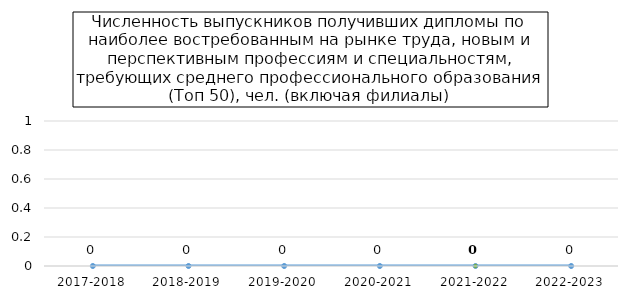
| Category | Series 0 |
|---|---|
| 2017-2018 | 0 |
| 2018-2019 | 0 |
| 2019-2020 | 0 |
| 2020-2021 | 0 |
| 2021-2022 | 0 |
| 2022-2023 | 0 |